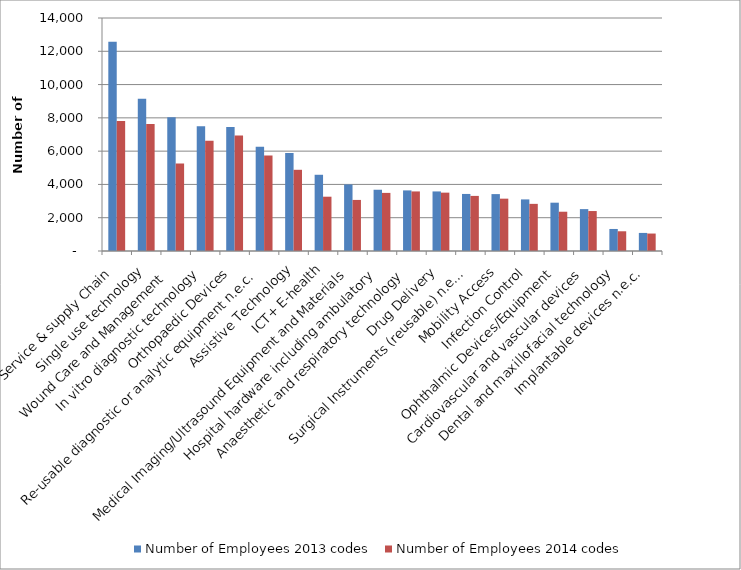
| Category | Number of Employees 2013 codes | Number of Employees 2014 codes |
|---|---|---|
| Service & supply Chain | 12573 | 7814 |
| Single use technology | 9144 | 7627.69 |
| Wound Care and Management  | 8042 | 5254.65 |
| In vitro diagnostic technology | 7493 | 6628.25 |
| Orthopaedic Devices | 7449 | 6940.36 |
| Re-usable diagnostic or analytic equipment n.e.c. | 6260 | 5741.8 |
| Assistive Technology | 5881 | 4878.9 |
| ICT+ E-health | 4580 | 3262.63 |
| Medical Imaging/Ultrasound Equipment and Materials | 3999 | 3068.5 |
| Hospital hardware including ambulatory | 3681 | 3491.3 |
| Anaesthetic and respiratory technology | 3641 | 3578.8 |
| Drug Delivery | 3579 | 3506.2 |
| Surgical Instruments (reusable) n.e.c. | 3428 | 3310.5 |
| Mobility Access | 3419 | 3144.69 |
| Infection Control  | 3100 | 2832.45 |
| Ophthalmic Devices/Equipment | 2903 | 2360.3 |
| Cardiovascular and vascular devices | 2517 | 2401.2 |
| Dental and maxillofacial technology | 1324 | 1184.8 |
| Implantable devices n.e.c. | 1086 | 1049 |